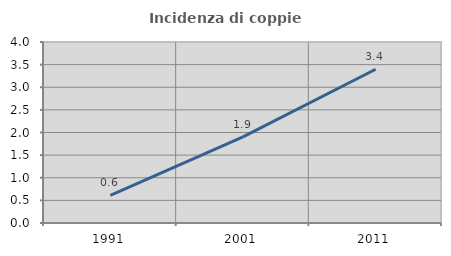
| Category | Incidenza di coppie miste |
|---|---|
| 1991.0 | 0.611 |
| 2001.0 | 1.905 |
| 2011.0 | 3.399 |